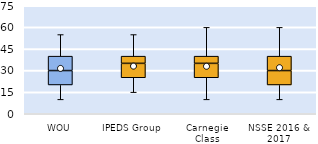
| Category | 25th | 50th | 75th |
|---|---|---|---|
| WOU | 20 | 10 | 10 |
| IPEDS Group | 25 | 10 | 5 |
| Carnegie Class | 25 | 10 | 5 |
| NSSE 2016 & 2017 | 20 | 10 | 10 |